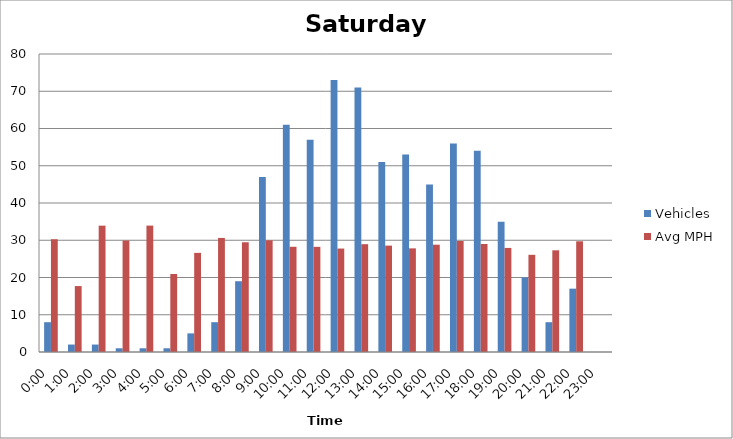
| Category | Vehicles | Avg MPH |
|---|---|---|
| 0:00 | 8 | 30.27 |
| 1:00 | 2 | 17.7 |
| 2:00 | 2 | 33.92 |
| 3:00 | 1 | 29.92 |
| 4:00 | 1 | 33.93 |
| 5:00 | 1 | 20.94 |
| 6:00 | 5 | 26.61 |
| 7:00 | 8 | 30.62 |
| 8:00 | 19 | 29.46 |
| 9:00 | 47 | 29.98 |
| 10:00 | 61 | 28.25 |
| 11:00 | 57 | 28.23 |
| 12:00 | 73 | 27.77 |
| 13:00 | 71 | 28.94 |
| 14:00 | 51 | 28.56 |
| 15:00 | 53 | 27.82 |
| 16:00 | 45 | 28.81 |
| 17:00 | 56 | 29.8 |
| 18:00 | 54 | 29 |
| 19:00 | 35 | 27.94 |
| 20:00 | 20 | 26.09 |
| 21:00 | 8 | 27.3 |
| 22:00 | 17 | 29.72 |
| 23:00 | 0 | 0 |